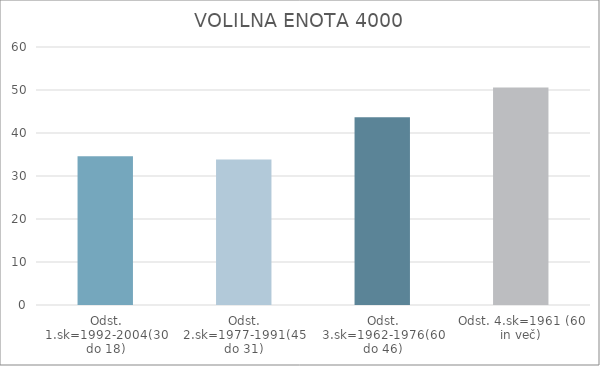
| Category | Series 0 |
|---|---|
| Odst. 1.sk=1992-2004(30 do 18) | 34.57 |
| Odst. 2.sk=1977-1991(45 do 31) | 33.81 |
| Odst. 3.sk=1962-1976(60 do 46) | 43.64 |
| Odst. 4.sk=1961 (60 in več) | 50.56 |